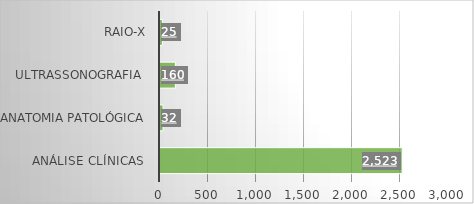
| Category | Series 0 |
|---|---|
| Análise Clínicas  | 2523 |
| Anatomia Patológica | 32 |
| Ultrassonografia  | 160 |
| RAIO-X | 25 |